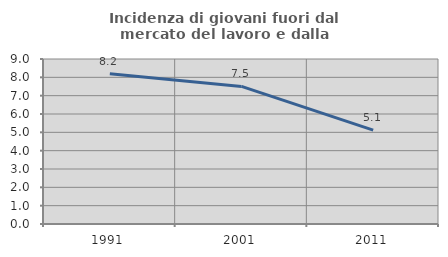
| Category | Incidenza di giovani fuori dal mercato del lavoro e dalla formazione  |
|---|---|
| 1991.0 | 8.191 |
| 2001.0 | 7.504 |
| 2011.0 | 5.124 |